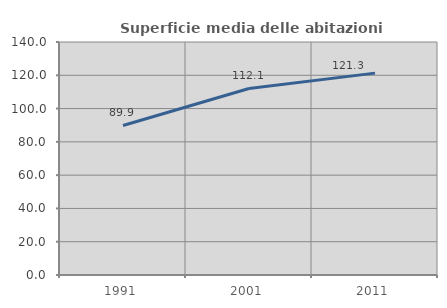
| Category | Superficie media delle abitazioni occupate |
|---|---|
| 1991.0 | 89.865 |
| 2001.0 | 112.073 |
| 2011.0 | 121.292 |